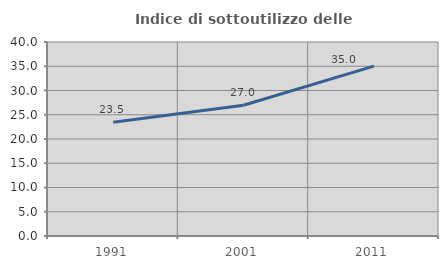
| Category | Indice di sottoutilizzo delle abitazioni  |
|---|---|
| 1991.0 | 23.473 |
| 2001.0 | 26.962 |
| 2011.0 | 35.027 |